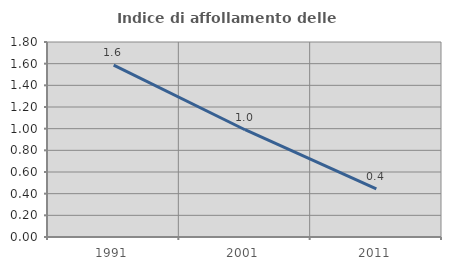
| Category | Indice di affollamento delle abitazioni  |
|---|---|
| 1991.0 | 1.586 |
| 2001.0 | 0.99 |
| 2011.0 | 0.445 |